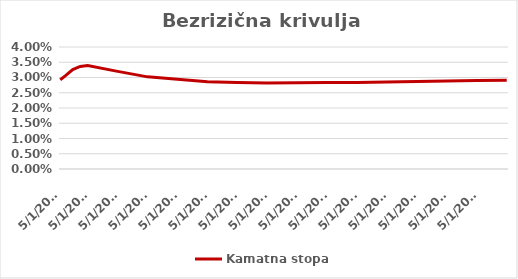
| Category | Kamatna stopa |
|---|---|
| 5/5/23 | 0.029 |
| 7/5/23 | 0.031 |
| 10/5/23 | 0.033 |
| 1/5/24 | 0.034 |
| 4/5/24 | 0.034 |
| 4/5/25 | 0.032 |
| 4/5/26 | 0.03 |
| 4/5/27 | 0.029 |
| 4/5/28 | 0.029 |
| 4/5/29 | 0.028 |
| 4/5/30 | 0.028 |
| 4/5/31 | 0.028 |
| 4/5/32 | 0.028 |
| 4/5/33 | 0.028 |
| 4/5/34 | 0.029 |
| 4/5/35 | 0.029 |
| 4/5/36 | 0.029 |
| 4/5/37 | 0.029 |
| 4/5/38 | 0.029 |